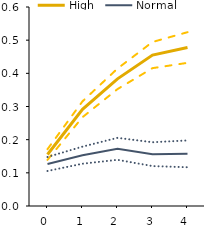
| Category | High | Series 4 | Series 5 | Normal | Series 1 | Series 2 |
|---|---|---|---|---|---|---|
| 0.0 | 0.155 | 0.171 | 0.139 | 0.127 | 0.148 | 0.106 |
| 1.0 | 0.292 | 0.316 | 0.268 | 0.153 | 0.179 | 0.127 |
| 2.0 | 0.383 | 0.414 | 0.352 | 0.172 | 0.206 | 0.139 |
| 3.0 | 0.455 | 0.495 | 0.416 | 0.156 | 0.192 | 0.12 |
| 4.0 | 0.478 | 0.524 | 0.432 | 0.157 | 0.198 | 0.117 |